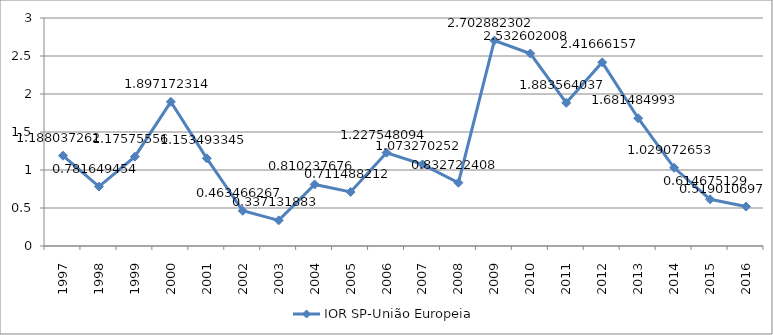
| Category | IOR SP-União Europeia |
|---|---|
| 1997.0 | 1.188 |
| 1998.0 | 0.782 |
| 1999.0 | 1.176 |
| 2000.0 | 1.897 |
| 2001.0 | 1.153 |
| 2002.0 | 0.463 |
| 2003.0 | 0.337 |
| 2004.0 | 0.81 |
| 2005.0 | 0.711 |
| 2006.0 | 1.228 |
| 2007.0 | 1.073 |
| 2008.0 | 0.833 |
| 2009.0 | 2.703 |
| 2010.0 | 2.533 |
| 2011.0 | 1.884 |
| 2012.0 | 2.417 |
| 2013.0 | 1.681 |
| 2014.0 | 1.029 |
| 2015.0 | 0.615 |
| 2016.0 | 0.519 |